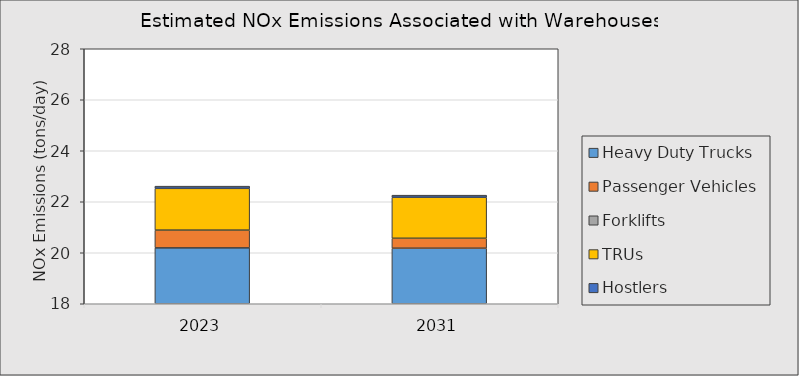
| Category | Heavy Duty Trucks | Passenger Vehicles | Forklifts | TRUs | Hostlers |
|---|---|---|---|---|---|
| 2023.0 | 20.191 | 0.697 | 0 | 1.638 | 0.085 |
| 2031.0 | 20.179 | 0.39 | 0 | 1.608 | 0.082 |